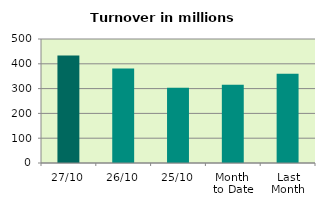
| Category | Series 0 |
|---|---|
| 27/10 | 433.24 |
| 26/10 | 381.52 |
| 25/10 | 303.348 |
| Month 
to Date | 315.322 |
| Last
Month | 360.198 |